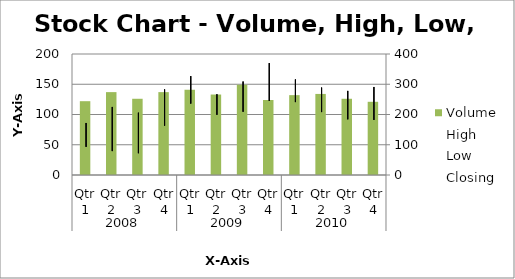
| Category | Volume |
|---|---|
| 0 | 122 |
| 1 | 137 |
| 2 | 126 |
| 3 | 137 |
| 4 | 141 |
| 5 | 133 |
| 6 | 149 |
| 7 | 124 |
| 8 | 132 |
| 9 | 134 |
| 10 | 126 |
| 11 | 121 |